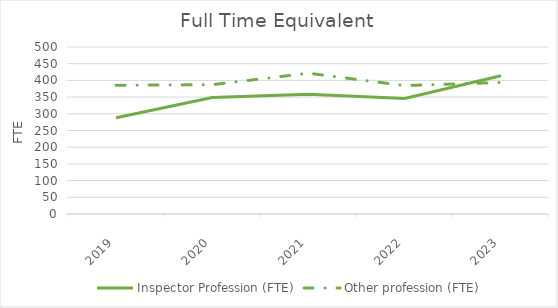
| Category | Inspector Profession (FTE) | Other profession (FTE) |
|---|---|---|
| 2019.0 | 288.2 | 385.2 |
| 2020.0 | 348.8 | 387.2 |
| 2021.0 | 358.4 | 421.5 |
| 2022.0 | 345.785 | 384.537 |
| 2023.0 | 414.051 | 393.707 |